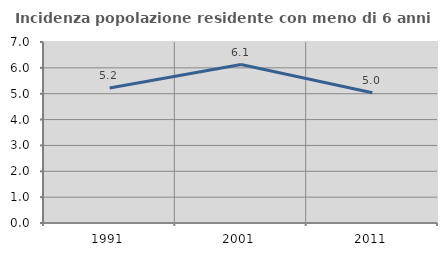
| Category | Incidenza popolazione residente con meno di 6 anni |
|---|---|
| 1991.0 | 5.224 |
| 2001.0 | 6.127 |
| 2011.0 | 5.04 |